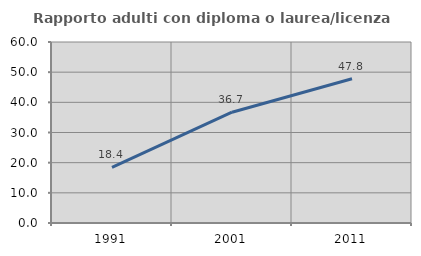
| Category | Rapporto adulti con diploma o laurea/licenza media  |
|---|---|
| 1991.0 | 18.421 |
| 2001.0 | 36.735 |
| 2011.0 | 47.826 |